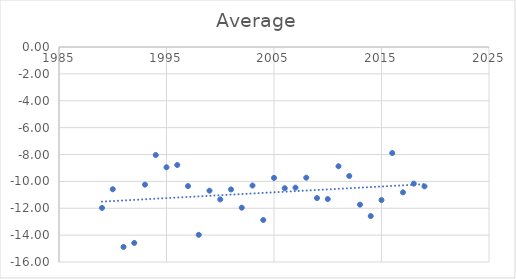
| Category | Average |
|---|---|
| 1989.0 | -11.975 |
| 1990.0 | -10.585 |
| 1991.0 | -14.88 |
| 1992.0 | -14.582 |
| 1993.0 | -10.244 |
| 1994.0 | -8.04 |
| 1995.0 | -8.95 |
| 1996.0 | -8.782 |
| 1997.0 | -10.35 |
| 1998.0 | -13.98 |
| 1999.0 | -10.692 |
| 2000.0 | -11.342 |
| 2001.0 | -10.6 |
| 2002.0 | -11.958 |
| 2003.0 | -10.308 |
| 2004.0 | -12.875 |
| 2005.0 | -9.742 |
| 2006.0 | -10.508 |
| 2007.0 | -10.467 |
| 2008.0 | -9.725 |
| 2009.0 | -11.242 |
| 2010.0 | -11.317 |
| 2011.0 | -8.875 |
| 2012.0 | -9.6 |
| 2013.0 | -11.733 |
| 2014.0 | -12.582 |
| 2015.0 | -11.392 |
| 2016.0 | -7.891 |
| 2017.0 | -10.817 |
| 2018.0 | -10.167 |
| 2019.0 | -10.371 |